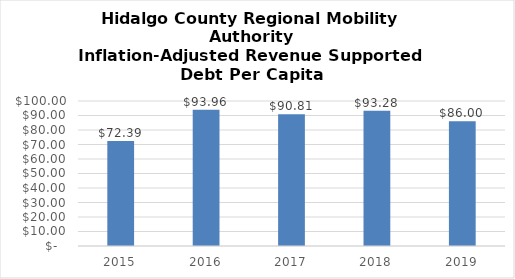
| Category | Series 0 |
|---|---|
| 2015.0 | 72.395 |
| 2016.0 | 93.961 |
| 2017.0 | 90.81 |
| 2018.0 | 93.28 |
| 2019.0 | 86 |